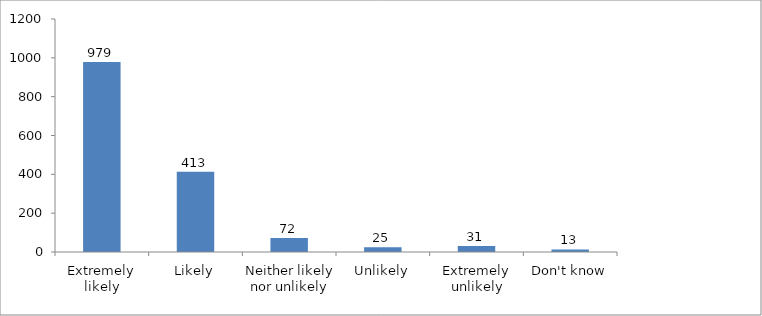
| Category | Series 0 |
|---|---|
| Extremely likely | 979 |
| Likely | 413 |
| Neither likely nor unlikely | 72 |
| Unlikely | 25 |
| Extremely unlikely | 31 |
| Don't know | 13 |